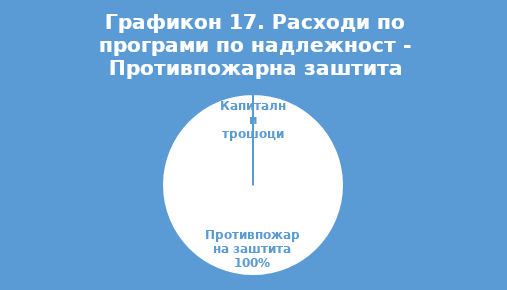
| Category | Структура |
|---|---|
| Противпожарна заштита | 100 |
| Капитални трошоци | 0 |